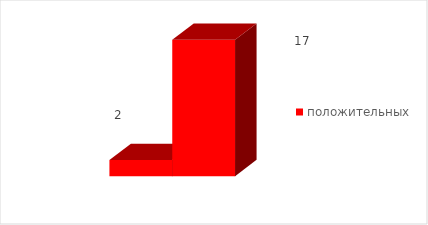
| Category | положительных |
|---|---|
| 0 | 17 |